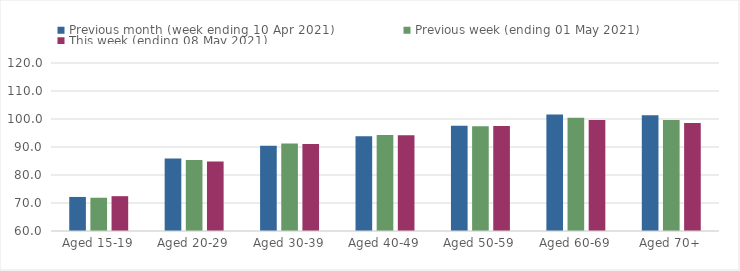
| Category | Previous month (week ending 10 Apr 2021) | Previous week (ending 01 May 2021) | This week (ending 08 May 2021) |
|---|---|---|---|
| Aged 15-19 | 72.16 | 71.88 | 72.44 |
| Aged 20-29 | 85.87 | 85.37 | 84.85 |
| Aged 30-39 | 90.47 | 91.29 | 91.07 |
| Aged 40-49 | 93.88 | 94.33 | 94.17 |
| Aged 50-59 | 97.56 | 97.44 | 97.5 |
| Aged 60-69 | 101.57 | 100.49 | 99.64 |
| Aged 70+ | 101.34 | 99.63 | 98.6 |